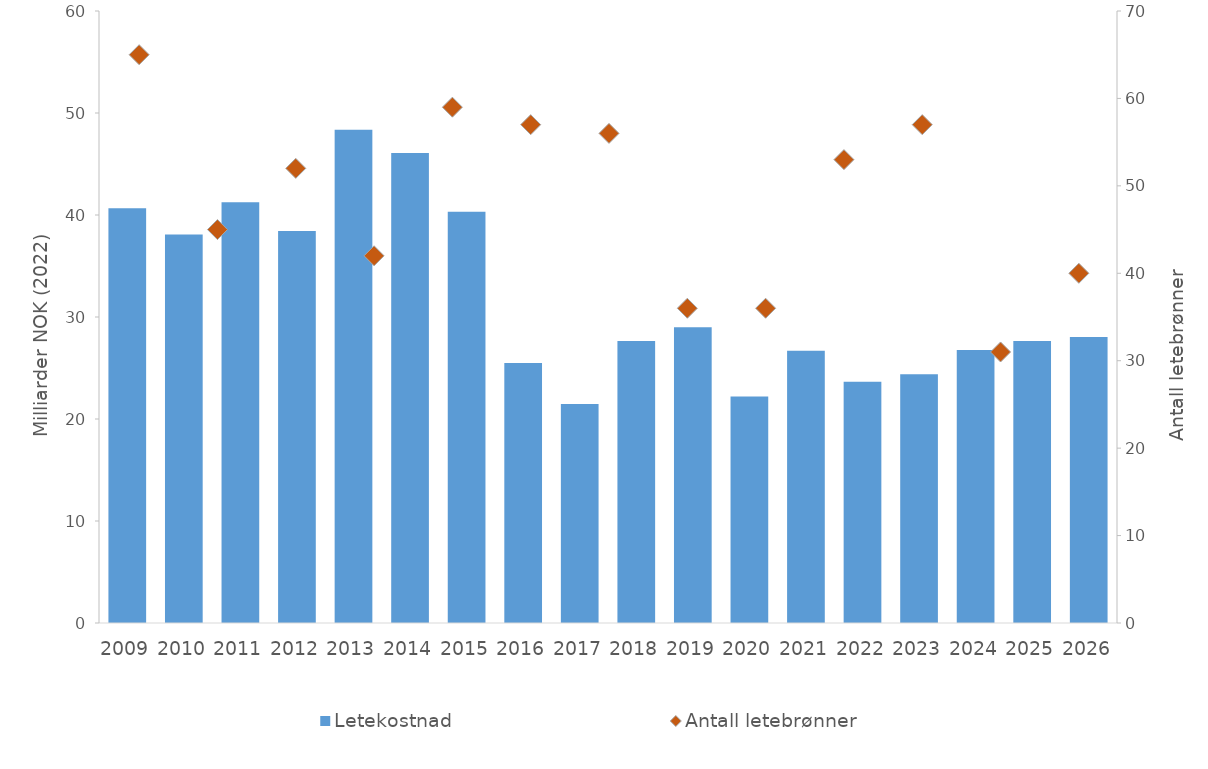
| Category | Letekostnad  |
|---|---|
| 2009.0 | 40.655 |
| 2010.0 | 38.1 |
| 2011.0 | 41.243 |
| 2012.0 | 38.428 |
| 2013.0 | 48.366 |
| 2014.0 | 46.084 |
| 2015.0 | 40.31 |
| 2016.0 | 25.501 |
| 2017.0 | 21.463 |
| 2018.0 | 27.655 |
| 2019.0 | 28.997 |
| 2020.0 | 22.216 |
| 2021.0 | 26.696 |
| 2022.0 | 23.642 |
| 2023.0 | 24.385 |
| 2024.0 | 26.767 |
| 2025.0 | 27.645 |
| 2026.0 | 28.037 |